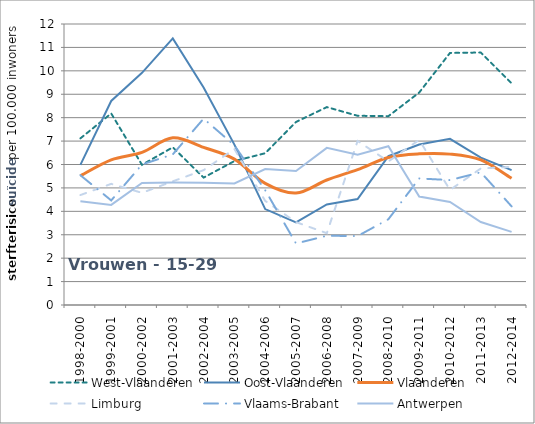
| Category | West-Vlaanderen | Oost-Vlaanderen | Vlaanderen | Limburg | Vlaams-Brabant | Antwerpen |
|---|---|---|---|---|---|---|
| 1998-2000 | 7.116 | 5.986 | 5.515 | 4.695 | 5.542 | 4.429 |
| 1999-2001 | 8.18 | 8.714 | 6.197 | 5.173 | 4.466 | 4.275 |
| 2000-2002 | 5.986 | 9.914 | 6.515 | 4.79 | 6 | 5.212 |
| 2001-2003 | 6.735 | 11.387 | 7.139 | 5.283 | 6.433 | 5.232 |
| 2002-2004 | 5.44 | 9.285 | 6.73 | 5.759 | 7.958 | 5.224 |
| 2003-2005 | 6.147 | 6.85 | 6.229 | 6.662 | 6.819 | 5.19 |
| 2004-2006 | 6.481 | 4.097 | 5.196 | 4.446 | 4.903 | 5.808 |
| 2005-2007 | 7.816 | 3.526 | 4.781 | 3.54 | 2.627 | 5.725 |
| 2006-2008 | 8.451 | 4.295 | 5.339 | 3.066 | 2.958 | 6.71 |
| 2007-2009 | 8.081 | 4.528 | 5.781 | 7.004 | 2.943 | 6.416 |
| 2008-2010 | 8.064 | 6.354 | 6.3 | 6.131 | 3.663 | 6.781 |
| 2009-2011 | 9.073 | 6.85 | 6.456 | 7.05 | 5.403 | 4.633 |
| 2010-2012 | 10.764 | 7.098 | 6.443 | 4.912 | 5.334 | 4.403 |
| 2011-2013 | 10.782 | 6.294 | 6.194 | 5.83 | 5.667 | 3.541 |
| 2012-2014 | 9.468 | 5.762 | 5.411 | 5.9 | 4.212 | 3.121 |